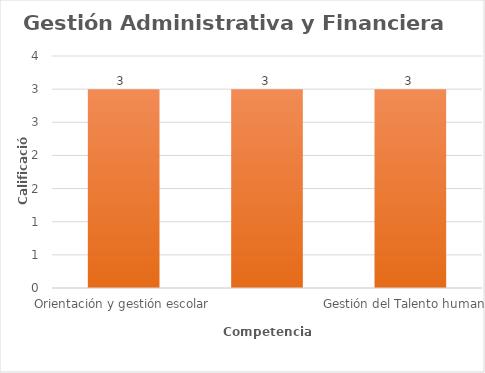
| Category | Series 0 |
|---|---|
| Orientación y gestión escolar | 3 |
| Administración de la planta física, los recursos y los servicios complementarios | 3 |
| Gestión del Talento humano | 3 |